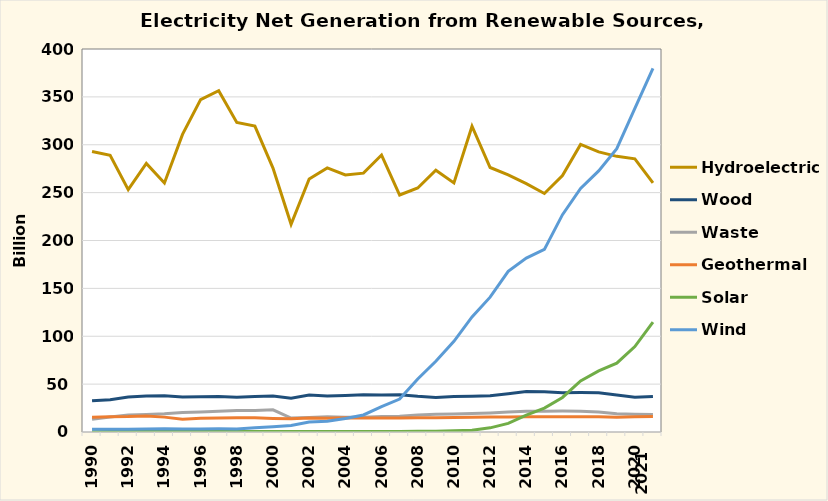
| Category | Hydroelectric | Wood | Waste | Geothermal | Solar | Wind |
|---|---|---|---|---|---|---|
| 1990.0 | 292.866 | 32.522 | 13.26 | 15.434 | 0.367 | 2.789 |
| 1991.0 | 288.994 | 33.725 | 15.665 | 15.966 | 0.472 | 2.951 |
| 1992.0 | 253.088 | 36.529 | 17.816 | 16.138 | 0.4 | 2.888 |
| 1993.0 | 280.494 | 37.623 | 18.333 | 16.789 | 0.462 | 3.006 |
| 1994.0 | 260.126 | 37.937 | 19.129 | 15.535 | 0.487 | 3.447 |
| 1995.0 | 310.833 | 36.521 | 20.405 | 13.378 | 0.497 | 3.164 |
| 1996.0 | 347.162 | 36.8 | 20.911 | 14.329 | 0.521 | 3.234 |
| 1997.0 | 356.453 | 36.948 | 21.709 | 14.726 | 0.511 | 3.288 |
| 1998.0 | 323.336 | 36.338 | 22.448 | 14.774 | 0.502 | 3.026 |
| 1999.0 | 319.536 | 37.041 | 22.572 | 14.827 | 0.495 | 4.488 |
| 2000.0 | 275.573 | 37.595 | 23.131 | 14.093 | 0.493 | 5.593 |
| 2001.0 | 216.961 | 35.2 | 14.548 | 13.741 | 0.543 | 6.737 |
| 2002.0 | 264.329 | 38.665 | 15.044 | 14.491 | 0.555 | 10.354 |
| 2003.0 | 275.806 | 37.529 | 15.812 | 14.424 | 0.534 | 11.187 |
| 2004.0 | 268.417 | 38.117 | 15.421 | 14.811 | 0.575 | 14.144 |
| 2005.0 | 270.321 | 38.856 | 15.42 | 14.692 | 0.55 | 17.811 |
| 2006.0 | 289.246 | 38.762 | 16.099 | 14.568 | 0.508 | 26.589 |
| 2007.0 | 247.51 | 39.014 | 16.525 | 14.637 | 0.612 | 34.45 |
| 2008.0 | 254.831 | 37.3 | 17.734 | 14.84 | 0.864 | 55.363 |
| 2009.0 | 273.445 | 36.05 | 18.443 | 15.009 | 0.891 | 73.886 |
| 2010.0 | 260.203 | 37.172 | 18.917 | 15.219 | 1.212 | 94.652 |
| 2011.0 | 319.355 | 37.449 | 19.222 | 15.316 | 1.818 | 120.177 |
| 2012.0 | 276.24 | 37.799 | 19.823 | 15.562 | 4.327 | 140.822 |
| 2013.0 | 268.565 | 40.028 | 20.83 | 15.775 | 9.036 | 167.84 |
| 2014.0 | 259.367 | 42.34 | 21.65 | 15.877 | 17.691 | 181.655 |
| 2015.0 | 249.08 | 41.929 | 21.703 | 15.918 | 24.893 | 190.719 |
| 2016.0 | 267.812 | 40.947 | 21.813 | 15.826 | 36.054 | 226.993 |
| 2017.0 | 300.333 | 41.124 | 21.61 | 15.927 | 53.287 | 254.303 |
| 2018.0 | 292.524 | 40.936 | 20.896 | 15.967 | 63.825 | 272.667 |
| 2019.0 | 287.874 | 38.543 | 18.964 | 15.473 | 71.937 | 295.882 |
| 2020.0 | 285.274 | 36.219 | 18.493 | 15.89 | 89.199 | 337.938 |
| 2021.0 | 260.225 | 37.17 | 18.309 | 16.238 | 114.678 | 379.767 |